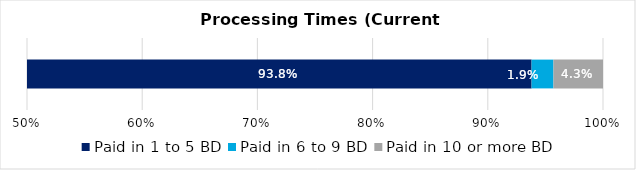
| Category | Paid in 1 to 5 BD | Paid in 6 to 9 BD | Paid in 10 or more BD |
|---|---|---|---|
| 0 | 0.938 | 0.019 | 0.043 |